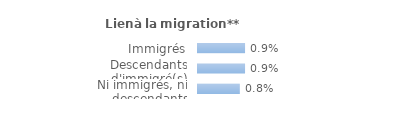
| Category | Series 0 |
|---|---|
| Immigrés | 0.009 |
| Descendants d'immigré(s) | 0.009 |
| Ni immigrés, ni descendants | 0.008 |